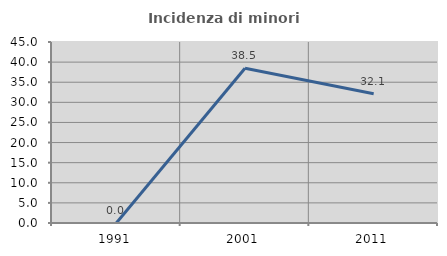
| Category | Incidenza di minori stranieri |
|---|---|
| 1991.0 | 0 |
| 2001.0 | 38.462 |
| 2011.0 | 32.143 |